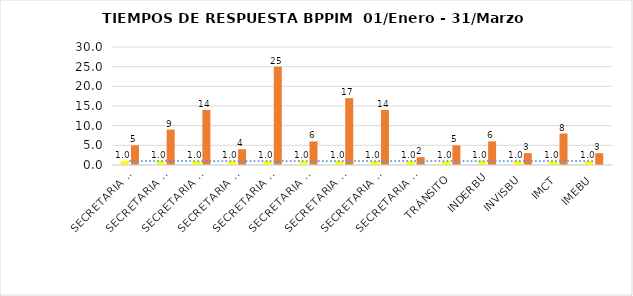
| Category | PROMEDIO DIAS HÁBILES | N. PROYECTOS |
|---|---|---|
| SECRETARIA ADMINISTRATIVA | 1 | 5 |
| SECRETARIA DESARROLLO SOCIAL | 1 | 9 |
| SECRETARIA DE EDUCACIÓN | 1 | 14 |
| SECRETARIA DE HACIENDA | 1 | 4 |
| SECRETARIA DE INFRAESTRUCTURA | 1 | 25 |
| SECRETARIA DE PLANEACION | 1 | 6 |
| SECRETARIA DE SALUD Y AMBIENTE | 1 | 17 |
| SECRETARIA DEL INTERIOR | 1 | 14 |
| SECRETARIA JURIDICA | 1 | 2 |
| TRÁNSITO | 1 | 5 |
| INDERBU | 1 | 6 |
| INVISBU | 1 | 3 |
| IMCT | 1 | 8 |
| IMEBU | 1 | 3 |